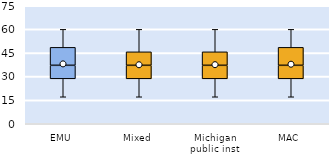
| Category | 25th | 50th | 75th |
|---|---|---|---|
| EMU | 28.571 | 8.571 | 11.429 |
| Mixed | 28.571 | 8.571 | 8.571 |
| Michigan public inst | 28.571 | 8.571 | 8.571 |
| MAC | 28.571 | 8.571 | 11.429 |